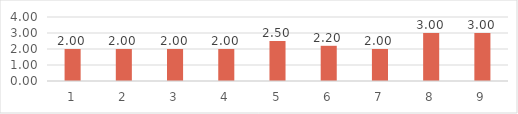
| Category | Series 0 |
|---|---|
| 0 | 2 |
| 1 | 2 |
| 2 | 2 |
| 3 | 2 |
| 4 | 2.5 |
| 5 | 2.2 |
| 6 | 2 |
| 7 | 3 |
| 8 | 3 |